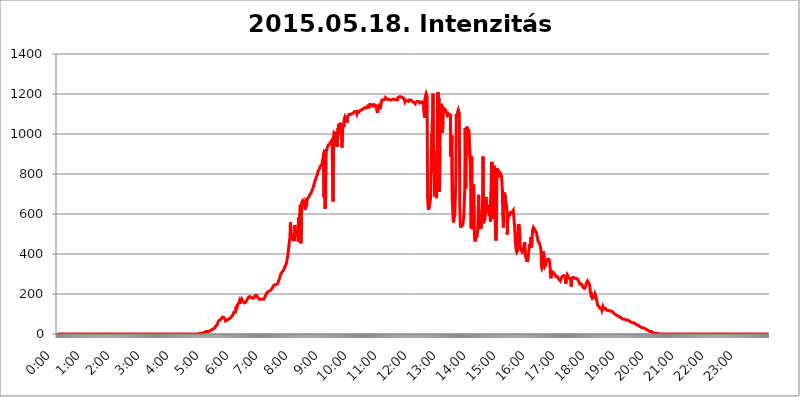
| Category | 2015.05.18. Intenzitás [W/m^2] |
|---|---|
| 0.0 | 0 |
| 0.0006944444444444445 | 0 |
| 0.001388888888888889 | 0 |
| 0.0020833333333333333 | 0 |
| 0.002777777777777778 | 0 |
| 0.003472222222222222 | 0 |
| 0.004166666666666667 | 0 |
| 0.004861111111111111 | 0 |
| 0.005555555555555556 | 0 |
| 0.0062499999999999995 | 0 |
| 0.006944444444444444 | 0 |
| 0.007638888888888889 | 0 |
| 0.008333333333333333 | 0 |
| 0.009027777777777779 | 0 |
| 0.009722222222222222 | 0 |
| 0.010416666666666666 | 0 |
| 0.011111111111111112 | 0 |
| 0.011805555555555555 | 0 |
| 0.012499999999999999 | 0 |
| 0.013194444444444444 | 0 |
| 0.013888888888888888 | 0 |
| 0.014583333333333332 | 0 |
| 0.015277777777777777 | 0 |
| 0.015972222222222224 | 0 |
| 0.016666666666666666 | 0 |
| 0.017361111111111112 | 0 |
| 0.018055555555555557 | 0 |
| 0.01875 | 0 |
| 0.019444444444444445 | 0 |
| 0.02013888888888889 | 0 |
| 0.020833333333333332 | 0 |
| 0.02152777777777778 | 0 |
| 0.022222222222222223 | 0 |
| 0.02291666666666667 | 0 |
| 0.02361111111111111 | 0 |
| 0.024305555555555556 | 0 |
| 0.024999999999999998 | 0 |
| 0.025694444444444447 | 0 |
| 0.02638888888888889 | 0 |
| 0.027083333333333334 | 0 |
| 0.027777777777777776 | 0 |
| 0.02847222222222222 | 0 |
| 0.029166666666666664 | 0 |
| 0.029861111111111113 | 0 |
| 0.030555555555555555 | 0 |
| 0.03125 | 0 |
| 0.03194444444444445 | 0 |
| 0.03263888888888889 | 0 |
| 0.03333333333333333 | 0 |
| 0.034027777777777775 | 0 |
| 0.034722222222222224 | 0 |
| 0.035416666666666666 | 0 |
| 0.036111111111111115 | 0 |
| 0.03680555555555556 | 0 |
| 0.0375 | 0 |
| 0.03819444444444444 | 0 |
| 0.03888888888888889 | 0 |
| 0.03958333333333333 | 0 |
| 0.04027777777777778 | 0 |
| 0.04097222222222222 | 0 |
| 0.041666666666666664 | 0 |
| 0.042361111111111106 | 0 |
| 0.04305555555555556 | 0 |
| 0.043750000000000004 | 0 |
| 0.044444444444444446 | 0 |
| 0.04513888888888889 | 0 |
| 0.04583333333333334 | 0 |
| 0.04652777777777778 | 0 |
| 0.04722222222222222 | 0 |
| 0.04791666666666666 | 0 |
| 0.04861111111111111 | 0 |
| 0.049305555555555554 | 0 |
| 0.049999999999999996 | 0 |
| 0.05069444444444445 | 0 |
| 0.051388888888888894 | 0 |
| 0.052083333333333336 | 0 |
| 0.05277777777777778 | 0 |
| 0.05347222222222222 | 0 |
| 0.05416666666666667 | 0 |
| 0.05486111111111111 | 0 |
| 0.05555555555555555 | 0 |
| 0.05625 | 0 |
| 0.05694444444444444 | 0 |
| 0.057638888888888885 | 0 |
| 0.05833333333333333 | 0 |
| 0.05902777777777778 | 0 |
| 0.059722222222222225 | 0 |
| 0.06041666666666667 | 0 |
| 0.061111111111111116 | 0 |
| 0.06180555555555556 | 0 |
| 0.0625 | 0 |
| 0.06319444444444444 | 0 |
| 0.06388888888888888 | 0 |
| 0.06458333333333334 | 0 |
| 0.06527777777777778 | 0 |
| 0.06597222222222222 | 0 |
| 0.06666666666666667 | 0 |
| 0.06736111111111111 | 0 |
| 0.06805555555555555 | 0 |
| 0.06874999999999999 | 0 |
| 0.06944444444444443 | 0 |
| 0.07013888888888889 | 0 |
| 0.07083333333333333 | 0 |
| 0.07152777777777779 | 0 |
| 0.07222222222222223 | 0 |
| 0.07291666666666667 | 0 |
| 0.07361111111111111 | 0 |
| 0.07430555555555556 | 0 |
| 0.075 | 0 |
| 0.07569444444444444 | 0 |
| 0.0763888888888889 | 0 |
| 0.07708333333333334 | 0 |
| 0.07777777777777778 | 0 |
| 0.07847222222222222 | 0 |
| 0.07916666666666666 | 0 |
| 0.0798611111111111 | 0 |
| 0.08055555555555556 | 0 |
| 0.08125 | 0 |
| 0.08194444444444444 | 0 |
| 0.08263888888888889 | 0 |
| 0.08333333333333333 | 0 |
| 0.08402777777777777 | 0 |
| 0.08472222222222221 | 0 |
| 0.08541666666666665 | 0 |
| 0.08611111111111112 | 0 |
| 0.08680555555555557 | 0 |
| 0.08750000000000001 | 0 |
| 0.08819444444444445 | 0 |
| 0.08888888888888889 | 0 |
| 0.08958333333333333 | 0 |
| 0.09027777777777778 | 0 |
| 0.09097222222222222 | 0 |
| 0.09166666666666667 | 0 |
| 0.09236111111111112 | 0 |
| 0.09305555555555556 | 0 |
| 0.09375 | 0 |
| 0.09444444444444444 | 0 |
| 0.09513888888888888 | 0 |
| 0.09583333333333333 | 0 |
| 0.09652777777777777 | 0 |
| 0.09722222222222222 | 0 |
| 0.09791666666666667 | 0 |
| 0.09861111111111111 | 0 |
| 0.09930555555555555 | 0 |
| 0.09999999999999999 | 0 |
| 0.10069444444444443 | 0 |
| 0.1013888888888889 | 0 |
| 0.10208333333333335 | 0 |
| 0.10277777777777779 | 0 |
| 0.10347222222222223 | 0 |
| 0.10416666666666667 | 0 |
| 0.10486111111111111 | 0 |
| 0.10555555555555556 | 0 |
| 0.10625 | 0 |
| 0.10694444444444444 | 0 |
| 0.1076388888888889 | 0 |
| 0.10833333333333334 | 0 |
| 0.10902777777777778 | 0 |
| 0.10972222222222222 | 0 |
| 0.1111111111111111 | 0 |
| 0.11180555555555556 | 0 |
| 0.11180555555555556 | 0 |
| 0.1125 | 0 |
| 0.11319444444444444 | 0 |
| 0.11388888888888889 | 0 |
| 0.11458333333333333 | 0 |
| 0.11527777777777777 | 0 |
| 0.11597222222222221 | 0 |
| 0.11666666666666665 | 0 |
| 0.1173611111111111 | 0 |
| 0.11805555555555557 | 0 |
| 0.11944444444444445 | 0 |
| 0.12013888888888889 | 0 |
| 0.12083333333333333 | 0 |
| 0.12152777777777778 | 0 |
| 0.12222222222222223 | 0 |
| 0.12291666666666667 | 0 |
| 0.12291666666666667 | 0 |
| 0.12361111111111112 | 0 |
| 0.12430555555555556 | 0 |
| 0.125 | 0 |
| 0.12569444444444444 | 0 |
| 0.12638888888888888 | 0 |
| 0.12708333333333333 | 0 |
| 0.16875 | 0 |
| 0.12847222222222224 | 0 |
| 0.12916666666666668 | 0 |
| 0.12986111111111112 | 0 |
| 0.13055555555555556 | 0 |
| 0.13125 | 0 |
| 0.13194444444444445 | 0 |
| 0.1326388888888889 | 0 |
| 0.13333333333333333 | 0 |
| 0.13402777777777777 | 0 |
| 0.13402777777777777 | 0 |
| 0.13472222222222222 | 0 |
| 0.13541666666666666 | 0 |
| 0.1361111111111111 | 0 |
| 0.13749999999999998 | 0 |
| 0.13819444444444443 | 0 |
| 0.1388888888888889 | 0 |
| 0.13958333333333334 | 0 |
| 0.14027777777777778 | 0 |
| 0.14097222222222222 | 0 |
| 0.14166666666666666 | 0 |
| 0.1423611111111111 | 0 |
| 0.14305555555555557 | 0 |
| 0.14375000000000002 | 0 |
| 0.14444444444444446 | 0 |
| 0.1451388888888889 | 0 |
| 0.1451388888888889 | 0 |
| 0.14652777777777778 | 0 |
| 0.14722222222222223 | 0 |
| 0.14791666666666667 | 0 |
| 0.1486111111111111 | 0 |
| 0.14930555555555555 | 0 |
| 0.15 | 0 |
| 0.15069444444444444 | 0 |
| 0.15138888888888888 | 0 |
| 0.15208333333333332 | 0 |
| 0.15277777777777776 | 0 |
| 0.15347222222222223 | 0 |
| 0.15416666666666667 | 0 |
| 0.15486111111111112 | 0 |
| 0.15555555555555556 | 0 |
| 0.15625 | 0 |
| 0.15694444444444444 | 0 |
| 0.15763888888888888 | 0 |
| 0.15833333333333333 | 0 |
| 0.15902777777777777 | 0 |
| 0.15972222222222224 | 0 |
| 0.16041666666666668 | 0 |
| 0.16111111111111112 | 0 |
| 0.16180555555555556 | 0 |
| 0.1625 | 0 |
| 0.16319444444444445 | 0 |
| 0.1638888888888889 | 0 |
| 0.16458333333333333 | 0 |
| 0.16527777777777777 | 0 |
| 0.16597222222222222 | 0 |
| 0.16666666666666666 | 0 |
| 0.1673611111111111 | 0 |
| 0.16805555555555554 | 0 |
| 0.16874999999999998 | 0 |
| 0.16944444444444443 | 0 |
| 0.17013888888888887 | 0 |
| 0.1708333333333333 | 0 |
| 0.17152777777777775 | 0 |
| 0.17222222222222225 | 0 |
| 0.1729166666666667 | 0 |
| 0.17361111111111113 | 0 |
| 0.17430555555555557 | 0 |
| 0.17500000000000002 | 0 |
| 0.17569444444444446 | 0 |
| 0.1763888888888889 | 0 |
| 0.17708333333333334 | 0 |
| 0.17777777777777778 | 0 |
| 0.17847222222222223 | 0 |
| 0.17916666666666667 | 0 |
| 0.1798611111111111 | 0 |
| 0.18055555555555555 | 0 |
| 0.18125 | 0 |
| 0.18194444444444444 | 0 |
| 0.1826388888888889 | 0 |
| 0.18333333333333335 | 0 |
| 0.1840277777777778 | 0 |
| 0.18472222222222223 | 0 |
| 0.18541666666666667 | 0 |
| 0.18611111111111112 | 0 |
| 0.18680555555555556 | 0 |
| 0.1875 | 0 |
| 0.18819444444444444 | 0 |
| 0.18888888888888888 | 0 |
| 0.18958333333333333 | 0 |
| 0.19027777777777777 | 0 |
| 0.1909722222222222 | 0 |
| 0.19166666666666665 | 0 |
| 0.19236111111111112 | 0 |
| 0.19305555555555554 | 0 |
| 0.19375 | 0 |
| 0.19444444444444445 | 0 |
| 0.1951388888888889 | 0 |
| 0.19583333333333333 | 0 |
| 0.19652777777777777 | 0 |
| 0.19722222222222222 | 0 |
| 0.19791666666666666 | 0 |
| 0.1986111111111111 | 0 |
| 0.19930555555555554 | 0 |
| 0.19999999999999998 | 3.525 |
| 0.20069444444444443 | 3.525 |
| 0.20138888888888887 | 3.525 |
| 0.2020833333333333 | 3.525 |
| 0.2027777777777778 | 3.525 |
| 0.2034722222222222 | 3.525 |
| 0.2041666666666667 | 3.525 |
| 0.20486111111111113 | 3.525 |
| 0.20555555555555557 | 7.887 |
| 0.20625000000000002 | 7.887 |
| 0.20694444444444446 | 7.887 |
| 0.2076388888888889 | 12.257 |
| 0.20833333333333334 | 12.257 |
| 0.20902777777777778 | 12.257 |
| 0.20972222222222223 | 12.257 |
| 0.21041666666666667 | 12.257 |
| 0.2111111111111111 | 12.257 |
| 0.21180555555555555 | 12.257 |
| 0.2125 | 12.257 |
| 0.21319444444444444 | 12.257 |
| 0.2138888888888889 | 16.636 |
| 0.21458333333333335 | 16.636 |
| 0.2152777777777778 | 16.636 |
| 0.21597222222222223 | 16.636 |
| 0.21666666666666667 | 21.024 |
| 0.21736111111111112 | 21.024 |
| 0.21805555555555556 | 21.024 |
| 0.21875 | 25.419 |
| 0.21944444444444444 | 29.823 |
| 0.22013888888888888 | 29.823 |
| 0.22083333333333333 | 29.823 |
| 0.22152777777777777 | 34.234 |
| 0.2222222222222222 | 38.653 |
| 0.22291666666666665 | 38.653 |
| 0.2236111111111111 | 43.079 |
| 0.22430555555555556 | 47.511 |
| 0.225 | 51.951 |
| 0.22569444444444445 | 60.85 |
| 0.2263888888888889 | 65.31 |
| 0.22708333333333333 | 65.31 |
| 0.22777777777777777 | 69.775 |
| 0.22847222222222222 | 74.246 |
| 0.22916666666666666 | 74.246 |
| 0.2298611111111111 | 74.246 |
| 0.23055555555555554 | 74.246 |
| 0.23124999999999998 | 83.205 |
| 0.23194444444444443 | 83.205 |
| 0.23263888888888887 | 83.205 |
| 0.2333333333333333 | 83.205 |
| 0.2340277777777778 | 83.205 |
| 0.2347222222222222 | 78.722 |
| 0.2354166666666667 | 74.246 |
| 0.23611111111111113 | 65.31 |
| 0.23680555555555557 | 65.31 |
| 0.23750000000000002 | 69.775 |
| 0.23819444444444446 | 69.775 |
| 0.2388888888888889 | 74.246 |
| 0.23958333333333334 | 74.246 |
| 0.24027777777777778 | 74.246 |
| 0.24097222222222223 | 74.246 |
| 0.24166666666666667 | 78.722 |
| 0.2423611111111111 | 78.722 |
| 0.24305555555555555 | 83.205 |
| 0.24375 | 83.205 |
| 0.24444444444444446 | 87.692 |
| 0.24513888888888888 | 92.184 |
| 0.24583333333333335 | 92.184 |
| 0.2465277777777778 | 96.682 |
| 0.24722222222222223 | 101.184 |
| 0.24791666666666667 | 110.201 |
| 0.24861111111111112 | 114.716 |
| 0.24930555555555556 | 110.201 |
| 0.25 | 110.201 |
| 0.25069444444444444 | 137.347 |
| 0.2513888888888889 | 123.758 |
| 0.2520833333333333 | 128.284 |
| 0.25277777777777777 | 146.423 |
| 0.2534722222222222 | 146.423 |
| 0.25416666666666665 | 141.884 |
| 0.2548611111111111 | 155.509 |
| 0.2555555555555556 | 164.605 |
| 0.25625000000000003 | 164.605 |
| 0.2569444444444445 | 150.964 |
| 0.2576388888888889 | 178.264 |
| 0.25833333333333336 | 164.605 |
| 0.2590277777777778 | 173.709 |
| 0.25972222222222224 | 169.156 |
| 0.2604166666666667 | 164.605 |
| 0.2611111111111111 | 160.056 |
| 0.26180555555555557 | 160.056 |
| 0.2625 | 155.509 |
| 0.26319444444444445 | 155.509 |
| 0.2638888888888889 | 155.509 |
| 0.26458333333333334 | 160.056 |
| 0.2652777777777778 | 160.056 |
| 0.2659722222222222 | 164.605 |
| 0.26666666666666666 | 173.709 |
| 0.2673611111111111 | 178.264 |
| 0.26805555555555555 | 182.82 |
| 0.26875 | 187.378 |
| 0.26944444444444443 | 187.378 |
| 0.2701388888888889 | 187.378 |
| 0.2708333333333333 | 182.82 |
| 0.27152777777777776 | 182.82 |
| 0.2722222222222222 | 182.82 |
| 0.27291666666666664 | 182.82 |
| 0.2736111111111111 | 178.264 |
| 0.2743055555555555 | 178.264 |
| 0.27499999999999997 | 178.264 |
| 0.27569444444444446 | 178.264 |
| 0.27638888888888885 | 182.82 |
| 0.27708333333333335 | 187.378 |
| 0.2777777777777778 | 191.937 |
| 0.27847222222222223 | 191.937 |
| 0.2791666666666667 | 191.937 |
| 0.2798611111111111 | 191.937 |
| 0.28055555555555556 | 187.378 |
| 0.28125 | 182.82 |
| 0.28194444444444444 | 182.82 |
| 0.2826388888888889 | 178.264 |
| 0.2833333333333333 | 173.709 |
| 0.28402777777777777 | 173.709 |
| 0.2847222222222222 | 173.709 |
| 0.28541666666666665 | 173.709 |
| 0.28611111111111115 | 173.709 |
| 0.28680555555555554 | 173.709 |
| 0.28750000000000003 | 173.709 |
| 0.2881944444444445 | 173.709 |
| 0.2888888888888889 | 173.709 |
| 0.28958333333333336 | 173.709 |
| 0.2902777777777778 | 173.709 |
| 0.29097222222222224 | 178.264 |
| 0.2916666666666667 | 187.378 |
| 0.2923611111111111 | 191.937 |
| 0.29305555555555557 | 201.058 |
| 0.29375 | 201.058 |
| 0.29444444444444445 | 205.62 |
| 0.2951388888888889 | 210.182 |
| 0.29583333333333334 | 210.182 |
| 0.2965277777777778 | 214.746 |
| 0.2972222222222222 | 214.746 |
| 0.29791666666666666 | 214.746 |
| 0.2986111111111111 | 214.746 |
| 0.29930555555555555 | 219.309 |
| 0.3 | 219.309 |
| 0.30069444444444443 | 223.873 |
| 0.3013888888888889 | 228.436 |
| 0.3020833333333333 | 233 |
| 0.30277777777777776 | 237.564 |
| 0.3034722222222222 | 237.564 |
| 0.30416666666666664 | 242.127 |
| 0.3048611111111111 | 246.689 |
| 0.3055555555555555 | 246.689 |
| 0.30624999999999997 | 246.689 |
| 0.3069444444444444 | 246.689 |
| 0.3076388888888889 | 246.689 |
| 0.30833333333333335 | 251.251 |
| 0.3090277777777778 | 251.251 |
| 0.30972222222222223 | 255.813 |
| 0.3104166666666667 | 264.932 |
| 0.3111111111111111 | 269.49 |
| 0.31180555555555556 | 278.603 |
| 0.3125 | 287.709 |
| 0.31319444444444444 | 296.808 |
| 0.3138888888888889 | 301.354 |
| 0.3145833333333333 | 305.898 |
| 0.31527777777777777 | 305.898 |
| 0.3159722222222222 | 310.44 |
| 0.31666666666666665 | 314.98 |
| 0.31736111111111115 | 319.517 |
| 0.31805555555555554 | 324.052 |
| 0.31875000000000003 | 333.113 |
| 0.3194444444444445 | 337.639 |
| 0.3201388888888889 | 342.162 |
| 0.32083333333333336 | 346.682 |
| 0.3215277777777778 | 355.712 |
| 0.32222222222222224 | 369.23 |
| 0.3229166666666667 | 382.715 |
| 0.3236111111111111 | 400.638 |
| 0.32430555555555557 | 422.943 |
| 0.325 | 440.702 |
| 0.32569444444444445 | 467.187 |
| 0.3263888888888889 | 480.356 |
| 0.32708333333333334 | 558.261 |
| 0.3277777777777778 | 510.885 |
| 0.3284722222222222 | 497.836 |
| 0.32916666666666666 | 480.356 |
| 0.3298611111111111 | 475.972 |
| 0.33055555555555555 | 471.582 |
| 0.33125 | 471.582 |
| 0.33194444444444443 | 471.582 |
| 0.3326388888888889 | 471.582 |
| 0.3333333333333333 | 545.416 |
| 0.3340277777777778 | 489.108 |
| 0.3347222222222222 | 497.836 |
| 0.3354166666666667 | 519.555 |
| 0.3361111111111111 | 493.475 |
| 0.3368055555555556 | 489.108 |
| 0.33749999999999997 | 510.885 |
| 0.33819444444444446 | 462.786 |
| 0.33888888888888885 | 583.779 |
| 0.33958333333333335 | 471.582 |
| 0.34027777777777773 | 600.661 |
| 0.34097222222222223 | 646.537 |
| 0.3416666666666666 | 453.968 |
| 0.3423611111111111 | 536.82 |
| 0.3430555555555555 | 658.909 |
| 0.34375 | 658.909 |
| 0.3444444444444445 | 667.123 |
| 0.3451388888888889 | 663.019 |
| 0.3458333333333334 | 663.019 |
| 0.34652777777777777 | 654.791 |
| 0.34722222222222227 | 642.4 |
| 0.34791666666666665 | 621.613 |
| 0.34861111111111115 | 663.019 |
| 0.34930555555555554 | 663.019 |
| 0.35000000000000003 | 654.791 |
| 0.3506944444444444 | 675.311 |
| 0.3513888888888889 | 675.311 |
| 0.3520833333333333 | 679.395 |
| 0.3527777777777778 | 683.473 |
| 0.3534722222222222 | 691.608 |
| 0.3541666666666667 | 695.666 |
| 0.3548611111111111 | 699.717 |
| 0.35555555555555557 | 703.762 |
| 0.35625 | 707.8 |
| 0.35694444444444445 | 703.762 |
| 0.3576388888888889 | 719.877 |
| 0.35833333333333334 | 723.889 |
| 0.3590277777777778 | 731.896 |
| 0.3597222222222222 | 743.859 |
| 0.36041666666666666 | 751.803 |
| 0.3611111111111111 | 759.723 |
| 0.36180555555555555 | 763.674 |
| 0.3625 | 775.492 |
| 0.36319444444444443 | 783.342 |
| 0.3638888888888889 | 787.258 |
| 0.3645833333333333 | 795.074 |
| 0.3652777777777778 | 806.757 |
| 0.3659722222222222 | 814.519 |
| 0.3666666666666667 | 818.392 |
| 0.3673611111111111 | 822.26 |
| 0.3680555555555556 | 829.981 |
| 0.36874999999999997 | 837.682 |
| 0.36944444444444446 | 837.682 |
| 0.37013888888888885 | 841.526 |
| 0.37083333333333335 | 845.365 |
| 0.37152777777777773 | 853.029 |
| 0.37222222222222223 | 868.305 |
| 0.3729166666666666 | 879.719 |
| 0.3736111111111111 | 906.223 |
| 0.3743055555555555 | 683.473 |
| 0.375 | 921.298 |
| 0.3756944444444445 | 625.784 |
| 0.3763888888888889 | 671.22 |
| 0.3770833333333334 | 902.447 |
| 0.37777777777777777 | 921.298 |
| 0.37847222222222227 | 928.819 |
| 0.37916666666666665 | 936.33 |
| 0.37986111111111115 | 940.082 |
| 0.38055555555555554 | 947.58 |
| 0.38125000000000003 | 947.58 |
| 0.3819444444444444 | 951.327 |
| 0.3826388888888889 | 951.327 |
| 0.3833333333333333 | 955.071 |
| 0.3840277777777778 | 962.555 |
| 0.3847222222222222 | 962.555 |
| 0.3854166666666667 | 970.034 |
| 0.3861111111111111 | 973.772 |
| 0.38680555555555557 | 663.019 |
| 0.3875 | 981.244 |
| 0.38819444444444445 | 1003.65 |
| 0.3888888888888889 | 1003.65 |
| 0.38958333333333334 | 996.182 |
| 0.3902777777777778 | 955.071 |
| 0.3909722222222222 | 1011.118 |
| 0.39166666666666666 | 947.58 |
| 0.3923611111111111 | 936.33 |
| 0.39305555555555555 | 951.327 |
| 0.39375 | 1029.798 |
| 0.39444444444444443 | 1003.65 |
| 0.3951388888888889 | 1052.255 |
| 0.3958333333333333 | 1044.762 |
| 0.3965277777777778 | 1029.798 |
| 0.3972222222222222 | 1056.004 |
| 0.3979166666666667 | 1041.019 |
| 0.3986111111111111 | 999.916 |
| 0.3993055555555556 | 932.576 |
| 0.39999999999999997 | 1007.383 |
| 0.40069444444444446 | 1037.277 |
| 0.40138888888888885 | 1052.255 |
| 0.40208333333333335 | 1037.277 |
| 0.40277777777777773 | 1078.555 |
| 0.40347222222222223 | 1086.097 |
| 0.4041666666666666 | 1086.097 |
| 0.4048611111111111 | 1082.324 |
| 0.4055555555555555 | 1067.267 |
| 0.40625 | 1056.004 |
| 0.4069444444444445 | 1078.555 |
| 0.4076388888888889 | 1089.873 |
| 0.4083333333333334 | 1093.653 |
| 0.40902777777777777 | 1097.437 |
| 0.40972222222222227 | 1101.226 |
| 0.41041666666666665 | 1097.437 |
| 0.41111111111111115 | 1097.437 |
| 0.41180555555555554 | 1097.437 |
| 0.41250000000000003 | 1101.226 |
| 0.4131944444444444 | 1101.226 |
| 0.4138888888888889 | 1101.226 |
| 0.4145833333333333 | 1101.226 |
| 0.4152777777777778 | 1105.019 |
| 0.4159722222222222 | 1105.019 |
| 0.4166666666666667 | 1108.816 |
| 0.4173611111111111 | 1112.618 |
| 0.41805555555555557 | 1108.816 |
| 0.41875 | 1112.618 |
| 0.41944444444444445 | 1108.816 |
| 0.4201388888888889 | 1101.226 |
| 0.42083333333333334 | 1112.618 |
| 0.4215277777777778 | 1116.426 |
| 0.4222222222222222 | 1116.426 |
| 0.42291666666666666 | 1108.816 |
| 0.4236111111111111 | 1112.618 |
| 0.42430555555555555 | 1116.426 |
| 0.425 | 1120.238 |
| 0.42569444444444443 | 1120.238 |
| 0.4263888888888889 | 1120.238 |
| 0.4270833333333333 | 1120.238 |
| 0.4277777777777778 | 1124.056 |
| 0.4284722222222222 | 1124.056 |
| 0.4291666666666667 | 1124.056 |
| 0.4298611111111111 | 1127.879 |
| 0.4305555555555556 | 1131.708 |
| 0.43124999999999997 | 1131.708 |
| 0.43194444444444446 | 1131.708 |
| 0.43263888888888885 | 1131.708 |
| 0.43333333333333335 | 1131.708 |
| 0.43402777777777773 | 1131.708 |
| 0.43472222222222223 | 1131.708 |
| 0.4354166666666666 | 1139.384 |
| 0.4361111111111111 | 1139.384 |
| 0.4368055555555555 | 1135.543 |
| 0.4375 | 1135.543 |
| 0.4381944444444445 | 1147.086 |
| 0.4388888888888889 | 1147.086 |
| 0.4395833333333334 | 1150.946 |
| 0.44027777777777777 | 1147.086 |
| 0.44097222222222227 | 1143.232 |
| 0.44166666666666665 | 1139.384 |
| 0.44236111111111115 | 1143.232 |
| 0.44305555555555554 | 1143.232 |
| 0.44375000000000003 | 1139.384 |
| 0.4444444444444444 | 1147.086 |
| 0.4451388888888889 | 1147.086 |
| 0.4458333333333333 | 1150.946 |
| 0.4465277777777778 | 1143.232 |
| 0.4472222222222222 | 1143.232 |
| 0.4479166666666667 | 1124.056 |
| 0.4486111111111111 | 1124.056 |
| 0.44930555555555557 | 1105.019 |
| 0.45 | 1143.232 |
| 0.45069444444444445 | 1135.543 |
| 0.4513888888888889 | 1131.708 |
| 0.45208333333333334 | 1150.946 |
| 0.4527777777777778 | 1124.056 |
| 0.4534722222222222 | 1139.384 |
| 0.45416666666666666 | 1147.086 |
| 0.4548611111111111 | 1162.571 |
| 0.45555555555555555 | 1170.358 |
| 0.45625 | 1166.46 |
| 0.45694444444444443 | 1170.358 |
| 0.4576388888888889 | 1170.358 |
| 0.4583333333333333 | 1170.358 |
| 0.4590277777777778 | 1170.358 |
| 0.4597222222222222 | 1174.263 |
| 0.4604166666666667 | 1182.099 |
| 0.4611111111111111 | 1178.177 |
| 0.4618055555555556 | 1178.177 |
| 0.46249999999999997 | 1174.263 |
| 0.46319444444444446 | 1174.263 |
| 0.46388888888888885 | 1170.358 |
| 0.46458333333333335 | 1174.263 |
| 0.46527777777777773 | 1174.263 |
| 0.46597222222222223 | 1174.263 |
| 0.4666666666666666 | 1170.358 |
| 0.4673611111111111 | 1174.263 |
| 0.4680555555555555 | 1170.358 |
| 0.46875 | 1170.358 |
| 0.4694444444444445 | 1170.358 |
| 0.4701388888888889 | 1170.358 |
| 0.4708333333333334 | 1174.263 |
| 0.47152777777777777 | 1178.177 |
| 0.47222222222222227 | 1174.263 |
| 0.47291666666666665 | 1174.263 |
| 0.47361111111111115 | 1170.358 |
| 0.47430555555555554 | 1178.177 |
| 0.47500000000000003 | 1170.358 |
| 0.4756944444444444 | 1170.358 |
| 0.4763888888888889 | 1170.358 |
| 0.4770833333333333 | 1170.358 |
| 0.4777777777777778 | 1182.099 |
| 0.4784722222222222 | 1186.03 |
| 0.4791666666666667 | 1182.099 |
| 0.4798611111111111 | 1186.03 |
| 0.48055555555555557 | 1189.969 |
| 0.48125 | 1186.03 |
| 0.48194444444444445 | 1186.03 |
| 0.4826388888888889 | 1182.099 |
| 0.48333333333333334 | 1182.099 |
| 0.4840277777777778 | 1182.099 |
| 0.4847222222222222 | 1182.099 |
| 0.48541666666666666 | 1182.099 |
| 0.4861111111111111 | 1178.177 |
| 0.48680555555555555 | 1170.358 |
| 0.4875 | 1162.571 |
| 0.48819444444444443 | 1170.358 |
| 0.4888888888888889 | 1170.358 |
| 0.4895833333333333 | 1166.46 |
| 0.4902777777777778 | 1166.46 |
| 0.4909722222222222 | 1162.571 |
| 0.4916666666666667 | 1162.571 |
| 0.4923611111111111 | 1162.571 |
| 0.4930555555555556 | 1166.46 |
| 0.49374999999999997 | 1170.358 |
| 0.49444444444444446 | 1174.263 |
| 0.49513888888888885 | 1170.358 |
| 0.49583333333333335 | 1170.358 |
| 0.49652777777777773 | 1166.46 |
| 0.49722222222222223 | 1166.46 |
| 0.4979166666666666 | 1162.571 |
| 0.4986111111111111 | 1162.571 |
| 0.4993055555555555 | 1162.571 |
| 0.5 | 1158.689 |
| 0.5006944444444444 | 1154.814 |
| 0.5013888888888889 | 1154.814 |
| 0.5020833333333333 | 1150.946 |
| 0.5027777777777778 | 1158.689 |
| 0.5034722222222222 | 1158.689 |
| 0.5041666666666667 | 1158.689 |
| 0.5048611111111111 | 1162.571 |
| 0.5055555555555555 | 1158.689 |
| 0.50625 | 1162.571 |
| 0.5069444444444444 | 1162.571 |
| 0.5076388888888889 | 1158.689 |
| 0.5083333333333333 | 1154.814 |
| 0.5090277777777777 | 1154.814 |
| 0.5097222222222222 | 1158.689 |
| 0.5104166666666666 | 1158.689 |
| 0.5111111111111112 | 1158.689 |
| 0.5118055555555555 | 1162.571 |
| 0.5125000000000001 | 1154.814 |
| 0.5131944444444444 | 1166.46 |
| 0.513888888888889 | 1170.358 |
| 0.5145833333333333 | 1170.358 |
| 0.5152777777777778 | 1082.324 |
| 0.5159722222222222 | 1178.177 |
| 0.5166666666666667 | 1193.918 |
| 0.517361111111111 | 1201.843 |
| 0.5180555555555556 | 1197.876 |
| 0.5187499999999999 | 1186.03 |
| 0.5194444444444445 | 687.544 |
| 0.5201388888888888 | 634.105 |
| 0.5208333333333334 | 621.613 |
| 0.5215277777777778 | 625.784 |
| 0.5222222222222223 | 646.537 |
| 0.5229166666666667 | 658.909 |
| 0.5236111111111111 | 683.473 |
| 0.5243055555555556 | 822.26 |
| 0.525 | 999.916 |
| 0.5256944444444445 | 988.714 |
| 0.5263888888888889 | 1086.097 |
| 0.5270833333333333 | 1201.843 |
| 0.5277777777777778 | 806.757 |
| 0.5284722222222222 | 917.534 |
| 0.5291666666666667 | 715.858 |
| 0.5298611111111111 | 687.544 |
| 0.5305555555555556 | 829.981 |
| 0.53125 | 743.859 |
| 0.5319444444444444 | 679.395 |
| 0.5326388888888889 | 853.029 |
| 0.5333333333333333 | 1189.969 |
| 0.5340277777777778 | 1209.807 |
| 0.5347222222222222 | 1162.571 |
| 0.5354166666666667 | 1178.177 |
| 0.5361111111111111 | 711.832 |
| 0.5368055555555555 | 940.082 |
| 0.5375 | 1056.004 |
| 0.5381944444444444 | 1135.543 |
| 0.5388888888888889 | 1150.946 |
| 0.5395833333333333 | 1150.946 |
| 0.5402777777777777 | 1007.383 |
| 0.5409722222222222 | 1059.756 |
| 0.5416666666666666 | 1120.238 |
| 0.5423611111111112 | 1127.879 |
| 0.5430555555555555 | 1124.056 |
| 0.5437500000000001 | 1124.056 |
| 0.5444444444444444 | 1120.238 |
| 0.545138888888889 | 1124.056 |
| 0.5458333333333333 | 1116.426 |
| 0.5465277777777778 | 1101.226 |
| 0.5472222222222222 | 1093.653 |
| 0.5479166666666667 | 1089.873 |
| 0.548611111111111 | 1101.226 |
| 0.5493055555555556 | 1105.019 |
| 0.5499999999999999 | 1101.226 |
| 0.5506944444444445 | 1089.873 |
| 0.5513888888888888 | 1101.226 |
| 0.5520833333333334 | 887.309 |
| 0.5527777777777778 | 887.309 |
| 0.5534722222222223 | 992.448 |
| 0.5541666666666667 | 663.019 |
| 0.5548611111111111 | 663.019 |
| 0.5555555555555556 | 558.261 |
| 0.55625 | 566.793 |
| 0.5569444444444445 | 583.779 |
| 0.5576388888888889 | 600.661 |
| 0.5583333333333333 | 687.544 |
| 0.5590277777777778 | 763.674 |
| 0.5597222222222222 | 1101.226 |
| 0.5604166666666667 | 1101.226 |
| 0.5611111111111111 | 1082.324 |
| 0.5618055555555556 | 1112.618 |
| 0.5625 | 1120.238 |
| 0.5631944444444444 | 1116.426 |
| 0.5638888888888889 | 1101.226 |
| 0.5645833333333333 | 638.256 |
| 0.5652777777777778 | 553.986 |
| 0.5659722222222222 | 532.513 |
| 0.5666666666666667 | 541.121 |
| 0.5673611111111111 | 541.121 |
| 0.5680555555555555 | 541.121 |
| 0.56875 | 545.416 |
| 0.5694444444444444 | 566.793 |
| 0.5701388888888889 | 583.779 |
| 0.5708333333333333 | 588.009 |
| 0.5715277777777777 | 715.858 |
| 0.5722222222222222 | 1029.798 |
| 0.5729166666666666 | 727.896 |
| 0.5736111111111112 | 1003.65 |
| 0.5743055555555555 | 1037.277 |
| 0.5750000000000001 | 1033.537 |
| 0.5756944444444444 | 1022.323 |
| 0.576388888888889 | 1014.852 |
| 0.5770833333333333 | 1022.323 |
| 0.5777777777777778 | 1022.323 |
| 0.5784722222222222 | 1022.323 |
| 0.5791666666666667 | 864.493 |
| 0.579861111111111 | 743.859 |
| 0.5805555555555556 | 528.2 |
| 0.5812499999999999 | 887.309 |
| 0.5819444444444445 | 536.82 |
| 0.5826388888888888 | 523.88 |
| 0.5833333333333334 | 528.2 |
| 0.5840277777777778 | 747.834 |
| 0.5847222222222223 | 553.986 |
| 0.5854166666666667 | 475.972 |
| 0.5861111111111111 | 462.786 |
| 0.5868055555555556 | 475.972 |
| 0.5875 | 471.582 |
| 0.5881944444444445 | 471.582 |
| 0.5888888888888889 | 489.108 |
| 0.5895833333333333 | 519.555 |
| 0.5902777777777778 | 575.299 |
| 0.5909722222222222 | 695.666 |
| 0.5916666666666667 | 562.53 |
| 0.5923611111111111 | 523.88 |
| 0.5930555555555556 | 528.2 |
| 0.59375 | 571.049 |
| 0.5944444444444444 | 528.2 |
| 0.5951388888888889 | 532.513 |
| 0.5958333333333333 | 609.062 |
| 0.5965277777777778 | 654.791 |
| 0.5972222222222222 | 887.309 |
| 0.5979166666666667 | 553.986 |
| 0.5986111111111111 | 566.793 |
| 0.5993055555555555 | 562.53 |
| 0.6 | 575.299 |
| 0.6006944444444444 | 575.299 |
| 0.6013888888888889 | 683.473 |
| 0.6020833333333333 | 609.062 |
| 0.6027777777777777 | 617.436 |
| 0.6034722222222222 | 621.613 |
| 0.6041666666666666 | 625.784 |
| 0.6048611111111112 | 646.537 |
| 0.6055555555555555 | 600.661 |
| 0.6062500000000001 | 592.233 |
| 0.6069444444444444 | 621.613 |
| 0.607638888888889 | 562.53 |
| 0.6083333333333333 | 707.8 |
| 0.6090277777777778 | 860.676 |
| 0.6097222222222222 | 731.896 |
| 0.6104166666666667 | 856.855 |
| 0.611111111111111 | 588.009 |
| 0.6118055555555556 | 575.299 |
| 0.6124999999999999 | 719.877 |
| 0.6131944444444445 | 841.526 |
| 0.6138888888888888 | 629.948 |
| 0.6145833333333334 | 484.735 |
| 0.6152777777777778 | 467.187 |
| 0.6159722222222223 | 489.108 |
| 0.6166666666666667 | 829.981 |
| 0.6173611111111111 | 826.123 |
| 0.6180555555555556 | 802.868 |
| 0.61875 | 802.868 |
| 0.6194444444444445 | 791.169 |
| 0.6201388888888889 | 783.342 |
| 0.6208333333333333 | 806.757 |
| 0.6215277777777778 | 802.868 |
| 0.6222222222222222 | 798.974 |
| 0.6229166666666667 | 791.169 |
| 0.6236111111111111 | 759.723 |
| 0.6243055555555556 | 719.877 |
| 0.625 | 588.009 |
| 0.6256944444444444 | 532.513 |
| 0.6263888888888889 | 695.666 |
| 0.6270833333333333 | 707.8 |
| 0.6277777777777778 | 703.762 |
| 0.6284722222222222 | 683.473 |
| 0.6291666666666667 | 663.019 |
| 0.6298611111111111 | 646.537 |
| 0.6305555555555555 | 629.948 |
| 0.63125 | 497.836 |
| 0.6319444444444444 | 604.864 |
| 0.6326388888888889 | 596.45 |
| 0.6333333333333333 | 588.009 |
| 0.6340277777777777 | 588.009 |
| 0.6347222222222222 | 596.45 |
| 0.6354166666666666 | 600.661 |
| 0.6361111111111112 | 609.062 |
| 0.6368055555555555 | 609.062 |
| 0.6375000000000001 | 604.864 |
| 0.6381944444444444 | 609.062 |
| 0.638888888888889 | 613.252 |
| 0.6395833333333333 | 617.436 |
| 0.6402777777777778 | 617.436 |
| 0.6409722222222222 | 558.261 |
| 0.6416666666666667 | 528.2 |
| 0.642361111111111 | 462.786 |
| 0.6430555555555556 | 440.702 |
| 0.6437499999999999 | 418.492 |
| 0.6444444444444445 | 409.574 |
| 0.6451388888888888 | 405.108 |
| 0.6458333333333334 | 418.492 |
| 0.6465277777777778 | 532.513 |
| 0.6472222222222223 | 549.704 |
| 0.6479166666666667 | 541.121 |
| 0.6486111111111111 | 523.88 |
| 0.6493055555555556 | 436.27 |
| 0.65 | 422.943 |
| 0.6506944444444445 | 418.492 |
| 0.6513888888888889 | 418.492 |
| 0.6520833333333333 | 409.574 |
| 0.6527777777777778 | 414.035 |
| 0.6534722222222222 | 418.492 |
| 0.6541666666666667 | 414.035 |
| 0.6548611111111111 | 414.035 |
| 0.6555555555555556 | 458.38 |
| 0.65625 | 400.638 |
| 0.6569444444444444 | 400.638 |
| 0.6576388888888889 | 378.224 |
| 0.6583333333333333 | 396.164 |
| 0.6590277777777778 | 360.221 |
| 0.6597222222222222 | 364.728 |
| 0.6604166666666667 | 382.715 |
| 0.6611111111111111 | 405.108 |
| 0.6618055555555555 | 431.833 |
| 0.6625 | 449.551 |
| 0.6631944444444444 | 449.551 |
| 0.6638888888888889 | 436.27 |
| 0.6645833333333333 | 484.735 |
| 0.6652777777777777 | 431.833 |
| 0.6659722222222222 | 471.582 |
| 0.6666666666666666 | 519.555 |
| 0.6673611111111111 | 528.2 |
| 0.6680555555555556 | 523.88 |
| 0.6687500000000001 | 523.88 |
| 0.6694444444444444 | 506.542 |
| 0.6701388888888888 | 519.555 |
| 0.6708333333333334 | 523.88 |
| 0.6715277777777778 | 515.223 |
| 0.6722222222222222 | 506.542 |
| 0.6729166666666666 | 489.108 |
| 0.6736111111111112 | 480.356 |
| 0.6743055555555556 | 462.786 |
| 0.6749999999999999 | 458.38 |
| 0.6756944444444444 | 462.786 |
| 0.6763888888888889 | 453.968 |
| 0.6770833333333334 | 449.551 |
| 0.6777777777777777 | 431.833 |
| 0.6784722222222223 | 418.492 |
| 0.6791666666666667 | 337.639 |
| 0.6798611111111111 | 328.584 |
| 0.6805555555555555 | 328.584 |
| 0.68125 | 342.162 |
| 0.6819444444444445 | 414.035 |
| 0.6826388888888889 | 414.035 |
| 0.6833333333333332 | 351.198 |
| 0.6840277777777778 | 337.639 |
| 0.6847222222222222 | 333.113 |
| 0.6854166666666667 | 346.682 |
| 0.686111111111111 | 364.728 |
| 0.6868055555555556 | 369.23 |
| 0.6875 | 373.729 |
| 0.6881944444444444 | 378.224 |
| 0.688888888888889 | 378.224 |
| 0.6895833333333333 | 373.729 |
| 0.6902777777777778 | 364.728 |
| 0.6909722222222222 | 355.712 |
| 0.6916666666666668 | 301.354 |
| 0.6923611111111111 | 278.603 |
| 0.6930555555555555 | 296.808 |
| 0.69375 | 296.808 |
| 0.6944444444444445 | 310.44 |
| 0.6951388888888889 | 305.898 |
| 0.6958333333333333 | 310.44 |
| 0.6965277777777777 | 305.898 |
| 0.6972222222222223 | 301.354 |
| 0.6979166666666666 | 296.808 |
| 0.6986111111111111 | 292.259 |
| 0.6993055555555556 | 287.709 |
| 0.7000000000000001 | 287.709 |
| 0.7006944444444444 | 292.259 |
| 0.7013888888888888 | 287.709 |
| 0.7020833333333334 | 287.709 |
| 0.7027777777777778 | 287.709 |
| 0.7034722222222222 | 274.047 |
| 0.7041666666666666 | 274.047 |
| 0.7048611111111112 | 269.49 |
| 0.7055555555555556 | 264.932 |
| 0.7062499999999999 | 269.49 |
| 0.7069444444444444 | 278.603 |
| 0.7076388888888889 | 283.156 |
| 0.7083333333333334 | 287.709 |
| 0.7090277777777777 | 287.709 |
| 0.7097222222222223 | 292.259 |
| 0.7104166666666667 | 292.259 |
| 0.7111111111111111 | 292.259 |
| 0.7118055555555555 | 292.259 |
| 0.7125 | 287.709 |
| 0.7131944444444445 | 251.251 |
| 0.7138888888888889 | 255.813 |
| 0.7145833333333332 | 287.709 |
| 0.7152777777777778 | 296.808 |
| 0.7159722222222222 | 292.259 |
| 0.7166666666666667 | 287.709 |
| 0.717361111111111 | 283.156 |
| 0.7180555555555556 | 278.603 |
| 0.71875 | 278.603 |
| 0.7194444444444444 | 274.047 |
| 0.720138888888889 | 274.047 |
| 0.7208333333333333 | 237.564 |
| 0.7215277777777778 | 278.603 |
| 0.7222222222222222 | 283.156 |
| 0.7229166666666668 | 283.156 |
| 0.7236111111111111 | 283.156 |
| 0.7243055555555555 | 278.603 |
| 0.725 | 278.603 |
| 0.7256944444444445 | 278.603 |
| 0.7263888888888889 | 278.603 |
| 0.7270833333333333 | 274.047 |
| 0.7277777777777777 | 278.603 |
| 0.7284722222222223 | 283.156 |
| 0.7291666666666666 | 278.603 |
| 0.7298611111111111 | 274.047 |
| 0.7305555555555556 | 274.047 |
| 0.7312500000000001 | 264.932 |
| 0.7319444444444444 | 260.373 |
| 0.7326388888888888 | 251.251 |
| 0.7333333333333334 | 251.251 |
| 0.7340277777777778 | 246.689 |
| 0.7347222222222222 | 251.251 |
| 0.7354166666666666 | 246.689 |
| 0.7361111111111112 | 242.127 |
| 0.7368055555555556 | 237.564 |
| 0.7374999999999999 | 233 |
| 0.7381944444444444 | 228.436 |
| 0.7388888888888889 | 228.436 |
| 0.7395833333333334 | 228.436 |
| 0.7402777777777777 | 233 |
| 0.7409722222222223 | 237.564 |
| 0.7416666666666667 | 246.689 |
| 0.7423611111111111 | 255.813 |
| 0.7430555555555555 | 260.373 |
| 0.74375 | 264.932 |
| 0.7444444444444445 | 260.373 |
| 0.7451388888888889 | 255.813 |
| 0.7458333333333332 | 251.251 |
| 0.7465277777777778 | 246.689 |
| 0.7472222222222222 | 228.436 |
| 0.7479166666666667 | 201.058 |
| 0.748611111111111 | 210.182 |
| 0.7493055555555556 | 182.82 |
| 0.75 | 191.937 |
| 0.7506944444444444 | 178.264 |
| 0.751388888888889 | 173.709 |
| 0.7520833333333333 | 178.264 |
| 0.7527777777777778 | 182.82 |
| 0.7534722222222222 | 187.378 |
| 0.7541666666666668 | 201.058 |
| 0.7548611111111111 | 196.497 |
| 0.7555555555555555 | 187.378 |
| 0.75625 | 173.709 |
| 0.7569444444444445 | 164.605 |
| 0.7576388888888889 | 146.423 |
| 0.7583333333333333 | 150.964 |
| 0.7590277777777777 | 141.884 |
| 0.7597222222222223 | 137.347 |
| 0.7604166666666666 | 132.814 |
| 0.7611111111111111 | 128.284 |
| 0.7618055555555556 | 123.758 |
| 0.7625000000000001 | 123.758 |
| 0.7631944444444444 | 128.284 |
| 0.7638888888888888 | 119.235 |
| 0.7645833333333334 | 123.758 |
| 0.7652777777777778 | 137.347 |
| 0.7659722222222222 | 132.814 |
| 0.7666666666666666 | 123.758 |
| 0.7673611111111112 | 119.235 |
| 0.7680555555555556 | 123.758 |
| 0.7687499999999999 | 128.284 |
| 0.7694444444444444 | 128.284 |
| 0.7701388888888889 | 123.758 |
| 0.7708333333333334 | 119.235 |
| 0.7715277777777777 | 119.235 |
| 0.7722222222222223 | 119.235 |
| 0.7729166666666667 | 119.235 |
| 0.7736111111111111 | 119.235 |
| 0.7743055555555555 | 114.716 |
| 0.775 | 114.716 |
| 0.7756944444444445 | 114.716 |
| 0.7763888888888889 | 114.716 |
| 0.7770833333333332 | 114.716 |
| 0.7777777777777778 | 110.201 |
| 0.7784722222222222 | 110.201 |
| 0.7791666666666667 | 110.201 |
| 0.779861111111111 | 105.69 |
| 0.7805555555555556 | 105.69 |
| 0.78125 | 101.184 |
| 0.7819444444444444 | 101.184 |
| 0.782638888888889 | 96.682 |
| 0.7833333333333333 | 96.682 |
| 0.7840277777777778 | 96.682 |
| 0.7847222222222222 | 96.682 |
| 0.7854166666666668 | 92.184 |
| 0.7861111111111111 | 92.184 |
| 0.7868055555555555 | 87.692 |
| 0.7875 | 87.692 |
| 0.7881944444444445 | 87.692 |
| 0.7888888888888889 | 83.205 |
| 0.7895833333333333 | 83.205 |
| 0.7902777777777777 | 83.205 |
| 0.7909722222222223 | 83.205 |
| 0.7916666666666666 | 78.722 |
| 0.7923611111111111 | 78.722 |
| 0.7930555555555556 | 78.722 |
| 0.7937500000000001 | 74.246 |
| 0.7944444444444444 | 74.246 |
| 0.7951388888888888 | 74.246 |
| 0.7958333333333334 | 74.246 |
| 0.7965277777777778 | 74.246 |
| 0.7972222222222222 | 74.246 |
| 0.7979166666666666 | 69.775 |
| 0.7986111111111112 | 69.775 |
| 0.7993055555555556 | 69.775 |
| 0.7999999999999999 | 69.775 |
| 0.8006944444444444 | 65.31 |
| 0.8013888888888889 | 65.31 |
| 0.8020833333333334 | 65.31 |
| 0.8027777777777777 | 65.31 |
| 0.8034722222222223 | 60.85 |
| 0.8041666666666667 | 60.85 |
| 0.8048611111111111 | 60.85 |
| 0.8055555555555555 | 60.85 |
| 0.80625 | 56.398 |
| 0.8069444444444445 | 56.398 |
| 0.8076388888888889 | 56.398 |
| 0.8083333333333332 | 56.398 |
| 0.8090277777777778 | 51.951 |
| 0.8097222222222222 | 51.951 |
| 0.8104166666666667 | 51.951 |
| 0.811111111111111 | 47.511 |
| 0.8118055555555556 | 47.511 |
| 0.8125 | 47.511 |
| 0.8131944444444444 | 47.511 |
| 0.813888888888889 | 47.511 |
| 0.8145833333333333 | 43.079 |
| 0.8152777777777778 | 43.079 |
| 0.8159722222222222 | 38.653 |
| 0.8166666666666668 | 38.653 |
| 0.8173611111111111 | 38.653 |
| 0.8180555555555555 | 38.653 |
| 0.81875 | 34.234 |
| 0.8194444444444445 | 34.234 |
| 0.8201388888888889 | 34.234 |
| 0.8208333333333333 | 29.823 |
| 0.8215277777777777 | 29.823 |
| 0.8222222222222223 | 29.823 |
| 0.8229166666666666 | 29.823 |
| 0.8236111111111111 | 25.419 |
| 0.8243055555555556 | 25.419 |
| 0.8250000000000001 | 25.419 |
| 0.8256944444444444 | 21.024 |
| 0.8263888888888888 | 21.024 |
| 0.8270833333333334 | 21.024 |
| 0.8277777777777778 | 21.024 |
| 0.8284722222222222 | 16.636 |
| 0.8291666666666666 | 16.636 |
| 0.8298611111111112 | 16.636 |
| 0.8305555555555556 | 16.636 |
| 0.8312499999999999 | 12.257 |
| 0.8319444444444444 | 12.257 |
| 0.8326388888888889 | 12.257 |
| 0.8333333333333334 | 12.257 |
| 0.8340277777777777 | 12.257 |
| 0.8347222222222223 | 7.887 |
| 0.8354166666666667 | 7.887 |
| 0.8361111111111111 | 7.887 |
| 0.8368055555555555 | 7.887 |
| 0.8375 | 3.525 |
| 0.8381944444444445 | 3.525 |
| 0.8388888888888889 | 3.525 |
| 0.8395833333333332 | 3.525 |
| 0.8402777777777778 | 3.525 |
| 0.8409722222222222 | 3.525 |
| 0.8416666666666667 | 3.525 |
| 0.842361111111111 | 3.525 |
| 0.8430555555555556 | 0 |
| 0.84375 | 0 |
| 0.8444444444444444 | 0 |
| 0.845138888888889 | 0 |
| 0.8458333333333333 | 0 |
| 0.8465277777777778 | 0 |
| 0.8472222222222222 | 0 |
| 0.8479166666666668 | 0 |
| 0.8486111111111111 | 0 |
| 0.8493055555555555 | 0 |
| 0.85 | 0 |
| 0.8506944444444445 | 0 |
| 0.8513888888888889 | 0 |
| 0.8520833333333333 | 0 |
| 0.8527777777777777 | 0 |
| 0.8534722222222223 | 0 |
| 0.8541666666666666 | 0 |
| 0.8548611111111111 | 0 |
| 0.8555555555555556 | 0 |
| 0.8562500000000001 | 0 |
| 0.8569444444444444 | 0 |
| 0.8576388888888888 | 0 |
| 0.8583333333333334 | 0 |
| 0.8590277777777778 | 0 |
| 0.8597222222222222 | 0 |
| 0.8604166666666666 | 0 |
| 0.8611111111111112 | 0 |
| 0.8618055555555556 | 0 |
| 0.8624999999999999 | 0 |
| 0.8631944444444444 | 0 |
| 0.8638888888888889 | 0 |
| 0.8645833333333334 | 0 |
| 0.8652777777777777 | 0 |
| 0.8659722222222223 | 0 |
| 0.8666666666666667 | 0 |
| 0.8673611111111111 | 0 |
| 0.8680555555555555 | 0 |
| 0.86875 | 0 |
| 0.8694444444444445 | 0 |
| 0.8701388888888889 | 0 |
| 0.8708333333333332 | 0 |
| 0.8715277777777778 | 0 |
| 0.8722222222222222 | 0 |
| 0.8729166666666667 | 0 |
| 0.873611111111111 | 0 |
| 0.8743055555555556 | 0 |
| 0.875 | 0 |
| 0.8756944444444444 | 0 |
| 0.876388888888889 | 0 |
| 0.8770833333333333 | 0 |
| 0.8777777777777778 | 0 |
| 0.8784722222222222 | 0 |
| 0.8791666666666668 | 0 |
| 0.8798611111111111 | 0 |
| 0.8805555555555555 | 0 |
| 0.88125 | 0 |
| 0.8819444444444445 | 0 |
| 0.8826388888888889 | 0 |
| 0.8833333333333333 | 0 |
| 0.8840277777777777 | 0 |
| 0.8847222222222223 | 0 |
| 0.8854166666666666 | 0 |
| 0.8861111111111111 | 0 |
| 0.8868055555555556 | 0 |
| 0.8875000000000001 | 0 |
| 0.8881944444444444 | 0 |
| 0.8888888888888888 | 0 |
| 0.8895833333333334 | 0 |
| 0.8902777777777778 | 0 |
| 0.8909722222222222 | 0 |
| 0.8916666666666666 | 0 |
| 0.8923611111111112 | 0 |
| 0.8930555555555556 | 0 |
| 0.8937499999999999 | 0 |
| 0.8944444444444444 | 0 |
| 0.8951388888888889 | 0 |
| 0.8958333333333334 | 0 |
| 0.8965277777777777 | 0 |
| 0.8972222222222223 | 0 |
| 0.8979166666666667 | 0 |
| 0.8986111111111111 | 0 |
| 0.8993055555555555 | 0 |
| 0.9 | 0 |
| 0.9006944444444445 | 0 |
| 0.9013888888888889 | 0 |
| 0.9020833333333332 | 0 |
| 0.9027777777777778 | 0 |
| 0.9034722222222222 | 0 |
| 0.9041666666666667 | 0 |
| 0.904861111111111 | 0 |
| 0.9055555555555556 | 0 |
| 0.90625 | 0 |
| 0.9069444444444444 | 0 |
| 0.907638888888889 | 0 |
| 0.9083333333333333 | 0 |
| 0.9090277777777778 | 0 |
| 0.9097222222222222 | 0 |
| 0.9104166666666668 | 0 |
| 0.9111111111111111 | 0 |
| 0.9118055555555555 | 0 |
| 0.9125 | 0 |
| 0.9131944444444445 | 0 |
| 0.9138888888888889 | 0 |
| 0.9145833333333333 | 0 |
| 0.9152777777777777 | 0 |
| 0.9159722222222223 | 0 |
| 0.9166666666666666 | 0 |
| 0.9173611111111111 | 0 |
| 0.9180555555555556 | 0 |
| 0.9187500000000001 | 0 |
| 0.9194444444444444 | 0 |
| 0.9201388888888888 | 0 |
| 0.9208333333333334 | 0 |
| 0.9215277777777778 | 0 |
| 0.9222222222222222 | 0 |
| 0.9229166666666666 | 0 |
| 0.9236111111111112 | 0 |
| 0.9243055555555556 | 0 |
| 0.9249999999999999 | 0 |
| 0.9256944444444444 | 0 |
| 0.9263888888888889 | 0 |
| 0.9270833333333334 | 0 |
| 0.9277777777777777 | 0 |
| 0.9284722222222223 | 0 |
| 0.9291666666666667 | 0 |
| 0.9298611111111111 | 0 |
| 0.9305555555555555 | 0 |
| 0.93125 | 0 |
| 0.9319444444444445 | 0 |
| 0.9326388888888889 | 0 |
| 0.9333333333333332 | 0 |
| 0.9340277777777778 | 0 |
| 0.9347222222222222 | 0 |
| 0.9354166666666667 | 0 |
| 0.936111111111111 | 0 |
| 0.9368055555555556 | 0 |
| 0.9375 | 0 |
| 0.9381944444444444 | 0 |
| 0.938888888888889 | 0 |
| 0.9395833333333333 | 0 |
| 0.9402777777777778 | 0 |
| 0.9409722222222222 | 0 |
| 0.9416666666666668 | 0 |
| 0.9423611111111111 | 0 |
| 0.9430555555555555 | 0 |
| 0.94375 | 0 |
| 0.9444444444444445 | 0 |
| 0.9451388888888889 | 0 |
| 0.9458333333333333 | 0 |
| 0.9465277777777777 | 0 |
| 0.9472222222222223 | 0 |
| 0.9479166666666666 | 0 |
| 0.9486111111111111 | 0 |
| 0.9493055555555556 | 0 |
| 0.9500000000000001 | 0 |
| 0.9506944444444444 | 0 |
| 0.9513888888888888 | 0 |
| 0.9520833333333334 | 0 |
| 0.9527777777777778 | 0 |
| 0.9534722222222222 | 0 |
| 0.9541666666666666 | 0 |
| 0.9548611111111112 | 0 |
| 0.9555555555555556 | 0 |
| 0.9562499999999999 | 0 |
| 0.9569444444444444 | 0 |
| 0.9576388888888889 | 0 |
| 0.9583333333333334 | 0 |
| 0.9590277777777777 | 0 |
| 0.9597222222222223 | 0 |
| 0.9604166666666667 | 0 |
| 0.9611111111111111 | 0 |
| 0.9618055555555555 | 0 |
| 0.9625 | 0 |
| 0.9631944444444445 | 0 |
| 0.9638888888888889 | 0 |
| 0.9645833333333332 | 0 |
| 0.9652777777777778 | 0 |
| 0.9659722222222222 | 0 |
| 0.9666666666666667 | 0 |
| 0.967361111111111 | 0 |
| 0.9680555555555556 | 0 |
| 0.96875 | 0 |
| 0.9694444444444444 | 0 |
| 0.970138888888889 | 0 |
| 0.9708333333333333 | 0 |
| 0.9715277777777778 | 0 |
| 0.9722222222222222 | 0 |
| 0.9729166666666668 | 0 |
| 0.9736111111111111 | 0 |
| 0.9743055555555555 | 0 |
| 0.975 | 0 |
| 0.9756944444444445 | 0 |
| 0.9763888888888889 | 0 |
| 0.9770833333333333 | 0 |
| 0.9777777777777777 | 0 |
| 0.9784722222222223 | 0 |
| 0.9791666666666666 | 0 |
| 0.9798611111111111 | 0 |
| 0.9805555555555556 | 0 |
| 0.9812500000000001 | 0 |
| 0.9819444444444444 | 0 |
| 0.9826388888888888 | 0 |
| 0.9833333333333334 | 0 |
| 0.9840277777777778 | 0 |
| 0.9847222222222222 | 0 |
| 0.9854166666666666 | 0 |
| 0.9861111111111112 | 0 |
| 0.9868055555555556 | 0 |
| 0.9874999999999999 | 0 |
| 0.9881944444444444 | 0 |
| 0.9888888888888889 | 0 |
| 0.9895833333333334 | 0 |
| 0.9902777777777777 | 0 |
| 0.9909722222222223 | 0 |
| 0.9916666666666667 | 0 |
| 0.9923611111111111 | 0 |
| 0.9930555555555555 | 0 |
| 0.99375 | 0 |
| 0.9944444444444445 | 0 |
| 0.9951388888888889 | 0 |
| 0.9958333333333332 | 0 |
| 0.9965277777777778 | 0 |
| 0.9972222222222222 | 0 |
| 0.9979166666666667 | 0 |
| 0.998611111111111 | 0 |
| 0.9993055555555556 | 0 |